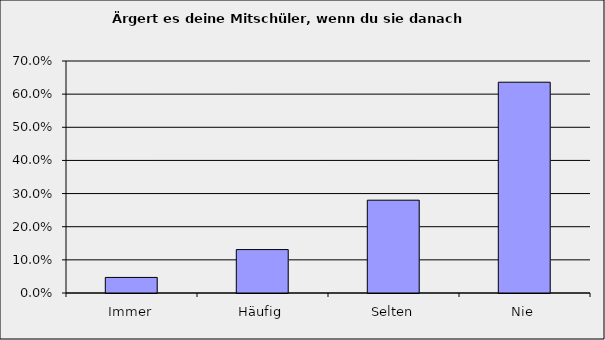
| Category | Series 0 |
|---|---|
| Immer | 0.047 |
| Häufig | 0.131 |
| Selten | 0.28 |
| Nie | 0.636 |